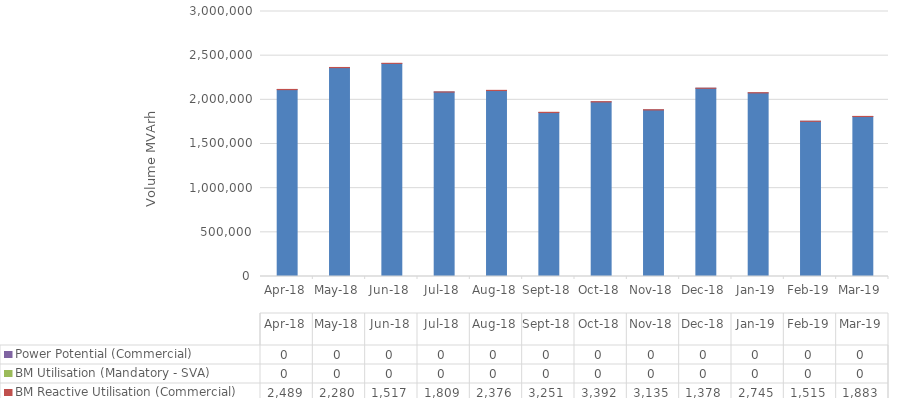
| Category | BM Default Utilisation (Mandatory - CVA) | BM Reactive Utilisation (Commercial) | BM Utilisation (Mandatory - SVA) | Power Potential (Commercial) |
|---|---|---|---|---|
| 2018-04-01 | 2115437.95 | 2489 | 0 | 0 |
| 2018-05-01 | 2364237.43 | 2280 | 0 | 0 |
| 2018-06-01 | 2412139.45 | 1517 | 0 | 0 |
| 2018-07-01 | 2087880.81 | 1809 | 0 | 0 |
| 2018-08-01 | 2105063.69 | 2376 | 0 | 0 |
| 2018-09-01 | 1855789.89 | 3250.66 | 0 | 0 |
| 2018-10-01 | 1976159.58 | 3391.84 | 0 | 0 |
| 2018-11-01 | 1885021.68 | 3135.34 | 0 | 0 |
| 2018-12-01 | 2130645.76 | 1378.23 | 0 | 0 |
| 2019-01-01 | 2078434.22 | 2745.22 | 0 | 0 |
| 2019-02-01 | 1756278.13 | 1515.17 | 0 | 0 |
| 2019-03-01 | 1810582.51 | 1883.04 | 0 | 0 |